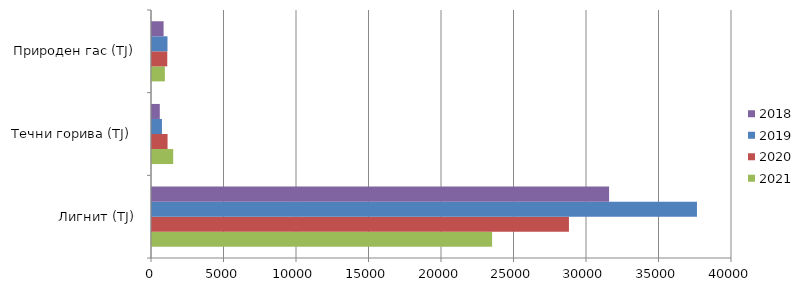
| Category | 2021 | 2020 | 2019 | 2018 |
|---|---|---|---|---|
| Лигнит (ТЈ) | 23455 | 28755 | 37584 | 31523 |
| Течни горива (ТЈ)  | 1462 | 1073 | 686 | 538 |
| Природен гас (TJ) | 888 | 1053 | 1067 | 800 |